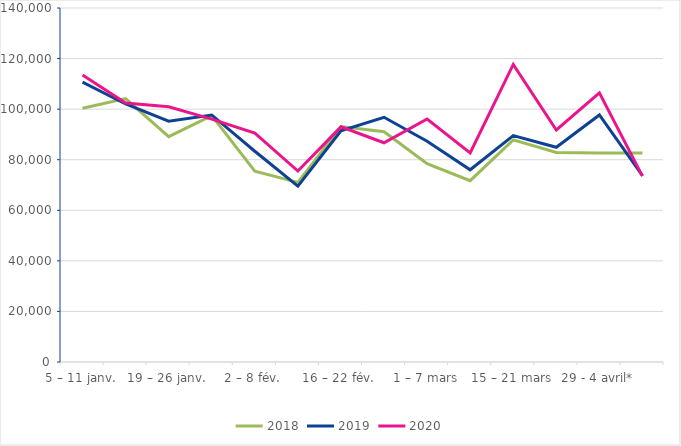
| Category | 2018 | 2019 | 2020 |
|---|---|---|---|
| 5 – 11 janv. | 100330 | 110701 | 113506 |
| 12 – 18 janv. | 104190 | 102045 | 102407 |
| 19 – 26 janv. | 89142 | 95260 | 100966 |
| 26 janv. – 1 fév. | 97441 | 97699 | 96042 |
| 2 – 8 fév. | 75434 | 83347 | 90495 |
| 9 – 15 fév. | 71031 | 69559 | 75523 |
| 16 – 22 fév. | 93102 | 91428 | 93003 |
| 23 – 29 fév. | 91065 | 96774 | 86699 |
| 1 – 7 mars | 78415 | 87314 | 96119 |
| 8 – 14 mars | 71697 | 76021 | 82690 |
| 15 – 21 mars | 87845 | 89536 | 117673 |
| 22 - 28 mars* | 82895 | 84912 | 91764 |
| 29 - 4 avril* | 82654 | 97699 | 106451 |
| 5 - 11 avril* | 82654 | 73699 | 73510 |